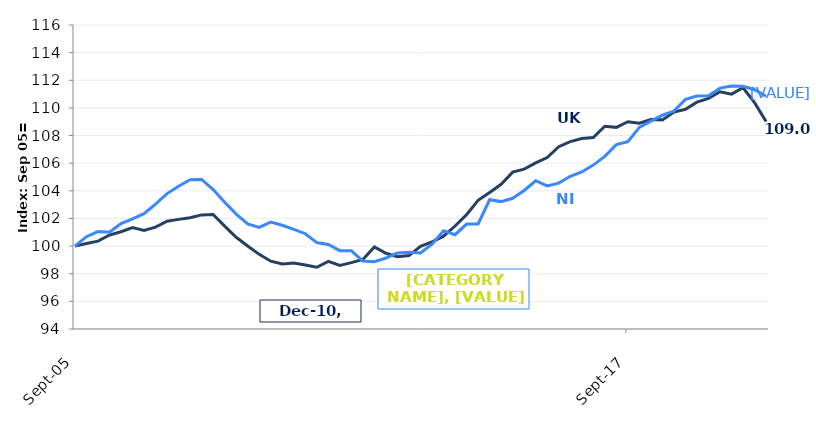
| Category | UK |
|---|---|
| 2005-09-01 | 100 |
| 2005-12-01 | 100.191 |
| 2006-03-01 | 100.361 |
| 2006-06-01 | 100.801 |
| 2006-09-01 | 101.039 |
| 2006-12-01 | 101.334 |
| 2007-03-01 | 101.132 |
| 2007-06-01 | 101.374 |
| 2007-09-01 | 101.796 |
| 2007-12-01 | 101.933 |
| 2008-03-01 | 102.052 |
| 2008-06-01 | 102.257 |
| 2008-09-01 | 102.286 |
| 2008-12-01 | 101.442 |
| 2009-03-01 | 100.638 |
| 2009-06-01 | 100.004 |
| 2009-09-01 | 99.401 |
| 2009-12-01 | 98.907 |
| 2010-03-01 | 98.713 |
| 2010-06-01 | 98.781 |
| 2010-09-01 | 98.626 |
| 2010-12-01 | 98.471 |
| 2011-03-01 | 98.893 |
| 2011-06-01 | 98.601 |
| 2011-09-01 | 98.806 |
| 2011-12-01 | 99.03 |
| 2012-03-01 | 99.942 |
| 2012-06-01 | 99.481 |
| 2012-09-01 | 99.228 |
| 2012-12-01 | 99.315 |
| 2013-03-01 | 99.978 |
| 2013-06-01 | 100.31 |
| 2013-09-01 | 100.718 |
| 2013-12-01 | 101.453 |
| 2014-03-01 | 102.275 |
| 2014-06-01 | 103.318 |
| 2014-09-01 | 103.873 |
| 2014-12-01 | 104.475 |
| 2015-03-01 | 105.355 |
| 2015-06-01 | 105.568 |
| 2015-09-01 | 106.019 |
| 2015-12-01 | 106.404 |
| 2016-03-01 | 107.194 |
| 2016-06-01 | 107.566 |
| 2016-09-01 | 107.789 |
| 2016-12-01 | 107.85 |
| 2017-03-01 | 108.669 |
| 2017-06-01 | 108.593 |
| 2017-09-01 | 109.001 |
| 2017-12-01 | 108.893 |
| 2018-03-01 | 109.163 |
| 2018-06-01 | 109.134 |
| 2018-09-01 | 109.7 |
| 2018-12-01 | 109.899 |
| 2019-03-01 | 110.414 |
| 2019-06-01 | 110.685 |
| 2019-09-01 | 111.172 |
| 2019-12-01 | 110.999 |
| 2020-03-01 | 111.456 |
| 2020-06-01 | 110.378 |
| 2020-09-01 | 109.015 |